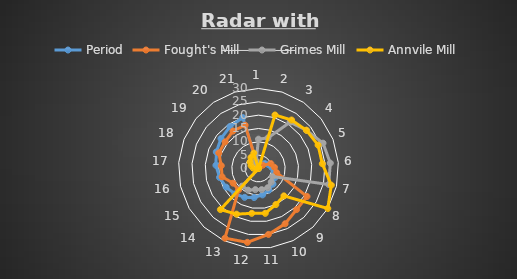
| Category | Period | Fought's Mill | Grimes Mill | Annvile Mill |
|---|---|---|---|---|
| 0 | 0 | 0 | 11 | 0 |
| 1 | 1 | 1 | 12 | 21 |
| 2 | 2 | 1 | 21 | 22 |
| 3 | 3 | 2 | 23 | 23 |
| 4 | 4 | 5 | 26 | 24 |
| 5 | 5 | 6 | 27 | 24 |
| 6 | 6 | 7 | 27 | 28 |
| 7 | 7 | 21 | 6 | 30 |
| 8 | 8 | 21 | 7 | 14 |
| 9 | 9 | 23 | 8 | 15 |
| 10 | 10 | 25 | 8 | 17 |
| 11 | 11 | 28 | 8 | 17 |
| 12 | 12 | 29 | 9 | 19 |
| 13 | 13 | 11 | 9 | 21 |
| 14 | 14 | 11 | 0 | 0 |
| 15 | 15 | 14 | 0 | 1 |
| 16 | 16 | 14 | 0 | 2 |
| 17 | 17 | 16 | 0 | 3 |
| 18 | 18 | 16 | 1 | 4 |
| 19 | 19 | 17 | 2 | 5 |
| 20 | 20 | 17 | 3 | 6 |